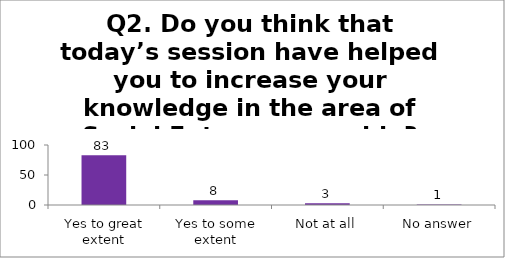
| Category | Q2. Do you think that today’s session have helped you to increase your knowledge in the area of Social Entrepreneurship? |
|---|---|
| Yes to great extent | 83 |
| Yes to some extent | 8 |
| Not at all | 3 |
| No answer | 1 |